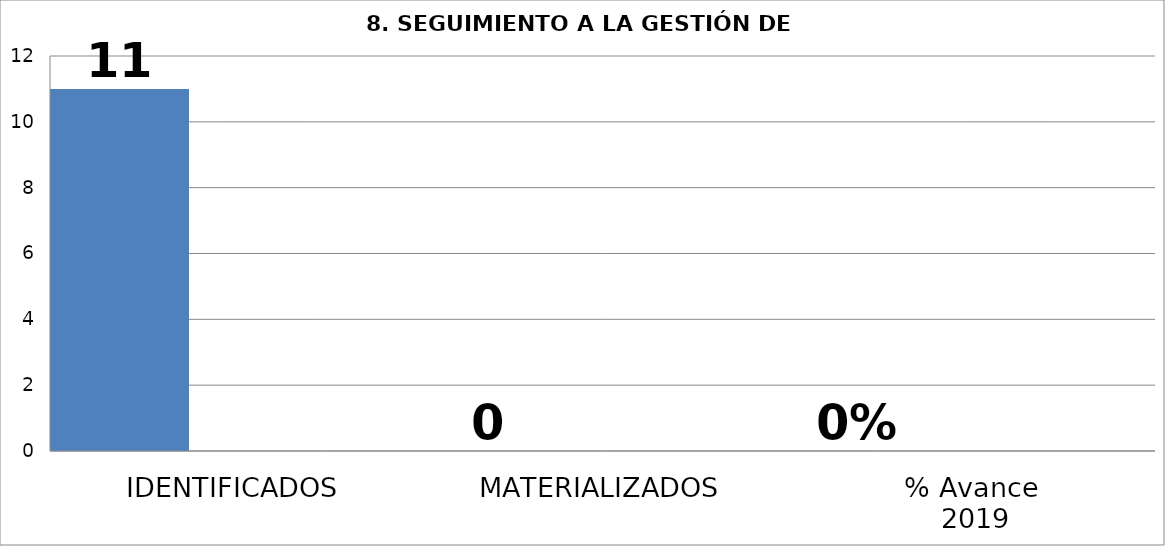
| Category | Series 2 | Series 4 | Series 0 | Series 1 | Series 10 | Series 12 | Series 13 | Series 14 | Series 15 | Series 17 | Series 18 | Series 20 |
|---|---|---|---|---|---|---|---|---|---|---|---|---|
| IDENTIFICADOS | 11 |  |  |  |  |  |  |  |  |  |  |  |
| MATERIALIZADOS | 0 |  |  |  |  |  |  |  |  |  |  |  |
| % Avance
 2019 | 0 |  |  |  |  |  |  |  |  |  |  |  |